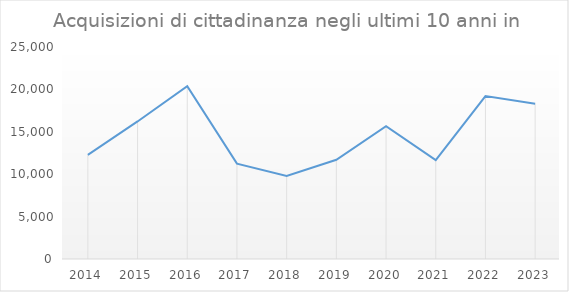
| Category | Series 0 |
|---|---|
| 2014.0 | 12275 |
| 2015.0 | 16221 |
| 2016.0 | 20372 |
| 2017.0 | 11247 |
| 2018.0 | 9801 |
| 2019.0 | 11702 |
| 2020.0 | 15660 |
| 2021.0 | 11660 |
| 2022.0 | 19208 |
| 2023.0 | 18308 |